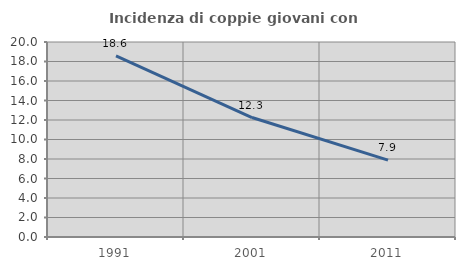
| Category | Incidenza di coppie giovani con figli |
|---|---|
| 1991.0 | 18.587 |
| 2001.0 | 12.252 |
| 2011.0 | 7.879 |